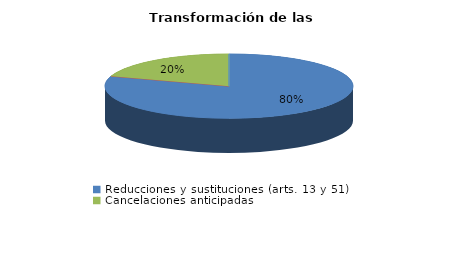
| Category | Series 0 |
|---|---|
| Reducciones y sustituciones (arts. 13 y 51) | 8 |
| Por quebrantamiento (art. 50.2) | 0 |
| Cancelaciones anticipadas | 2 |
| Traslado a Centros Penitenciarios | 0 |
| Conversión internamientos en cerrados (art. 51.2) | 0 |